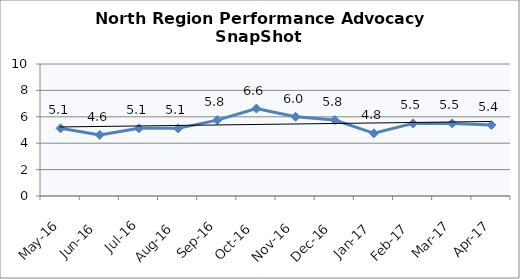
| Category | North Region |
|---|---|
| May-16 | 5.125 |
| Jun-16 | 4.625 |
| Jul-16 | 5.125 |
| Aug-16 | 5.125 |
| Sep-16 | 5.75 |
| Oct-16 | 6.625 |
| Nov-16 | 6 |
| Dec-16 | 5.75 |
| Jan-17 | 4.75 |
| Feb-17 | 5.5 |
| Mar-17 | 5.5 |
| Apr-17 | 5.375 |